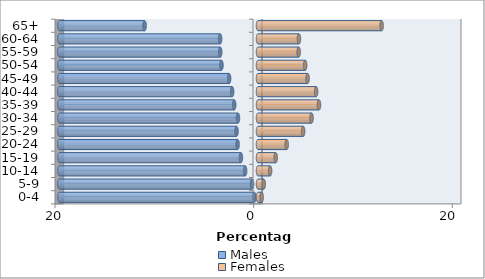
| Category | Males | Females |
|---|---|---|
| 0-4 | -0.366 | 0.366 |
| 5-9 | -0.598 | 0.577 |
| 10-14 | -1.296 | 1.22 |
| 15-19 | -1.719 | 1.783 |
| 20-24 | -2.055 | 2.89 |
| 25-29 | -2.163 | 4.547 |
| 30-34 | -2.019 | 5.392 |
| 35-39 | -2.396 | 6.14 |
| 40-44 | -2.602 | 5.855 |
| 45-49 | -2.904 | 4.991 |
| 50-54 | -3.678 | 4.75 |
| 55-59 | -3.804 | 4.095 |
| 60-64 | -3.814 | 4.119 |
| 65+ | -11.416 | 12.445 |